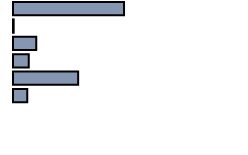
| Category | Series 0 |
|---|---|
| 0 | 48.275 |
| 1 | 0.289 |
| 2 | 10.074 |
| 3 | 6.797 |
| 4 | 28.328 |
| 5 | 6.237 |
| 6 | 0 |
| 7 | 0 |